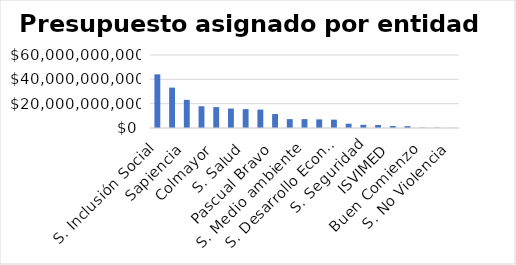
| Category | Presupuesto |
|---|---|
| S. Inclusión Social | 44091311588 |
| INDER | 33214458375 |
| Sapiencia | 23142600000 |
| S. Educación | 17883764147 |
| Colmayor | 17177489631 |
| S. Participación Ciudadana | 15977926057 |
| S. Salud | 15515886134 |
| S. Cultura Ciudadana | 15125500000 |
| Pascual Bravo | 11464269302 |
| ITM | 7284704167 |
| S. Medio ambiente | 7283046036 |
| S. Infraestructura | 7087842766 |
| S. Desarrollo Económico | 6859440660 |
| S. Comunicaciones | 3505431796 |
| S. Seguridad | 2604762199 |
| S. Juventud | 2485269714 |
| ISVIMED | 1583393582 |
| DAGRD | 1500000000 |
| Buen Comienzo | 308028489 |
| S. Mujeres | 244629758 |
| S. No Violencia | 109583333 |